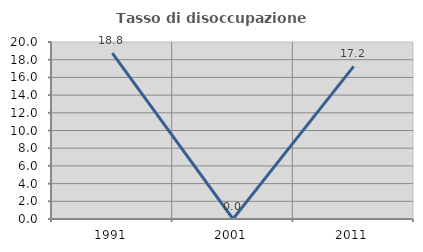
| Category | Tasso di disoccupazione giovanile  |
|---|---|
| 1991.0 | 18.75 |
| 2001.0 | 0 |
| 2011.0 | 17.241 |